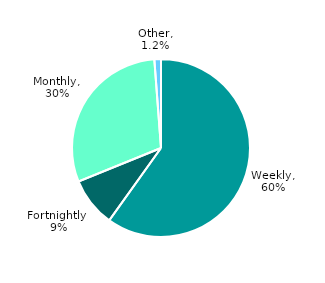
| Category | Series 0 |
|---|---|
| Weekly | 0.6 |
| Fortnightly | 0.09 |
| Monthly | 0.3 |
| Other | 0.012 |